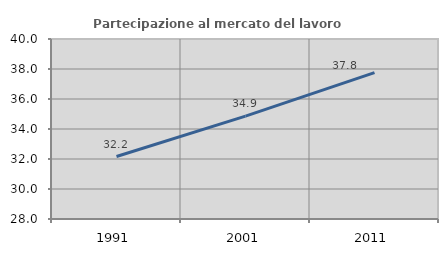
| Category | Partecipazione al mercato del lavoro  femminile |
|---|---|
| 1991.0 | 32.164 |
| 2001.0 | 34.859 |
| 2011.0 | 37.754 |